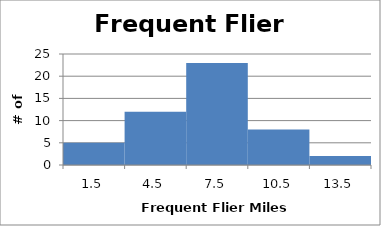
| Category | Frequent Flyer Miles |
|---|---|
| 1.5 | 5 |
| 4.5 | 12 |
| 7.5 | 23 |
| 10.5 | 8 |
| 13.5 | 2 |